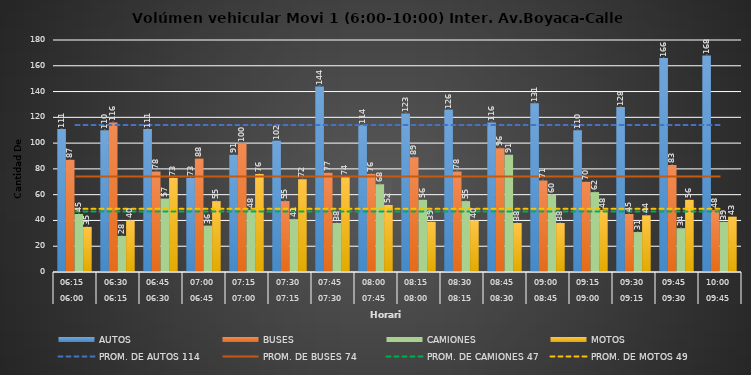
| Category | AUTOS | BUSES | CAMIONES | MOTOS |
|---|---|---|---|---|
| 0 | 111 | 87 | 45 | 35 |
| 1 | 110 | 116 | 28 | 40 |
| 2 | 111 | 78 | 57 | 73 |
| 3 | 73 | 88 | 36 | 55 |
| 4 | 91 | 100 | 48 | 76 |
| 5 | 102 | 55 | 41 | 72 |
| 6 | 144 | 77 | 38 | 74 |
| 7 | 114 | 76 | 68 | 52 |
| 8 | 123 | 89 | 56 | 39 |
| 9 | 126 | 78 | 55 | 40 |
| 10 | 116 | 96 | 91 | 38 |
| 11 | 131 | 71 | 60 | 38 |
| 12 | 110 | 70 | 62 | 48 |
| 13 | 128 | 45 | 31 | 44 |
| 14 | 166 | 83 | 34 | 56 |
| 15 | 168 | 48 | 39 | 43 |